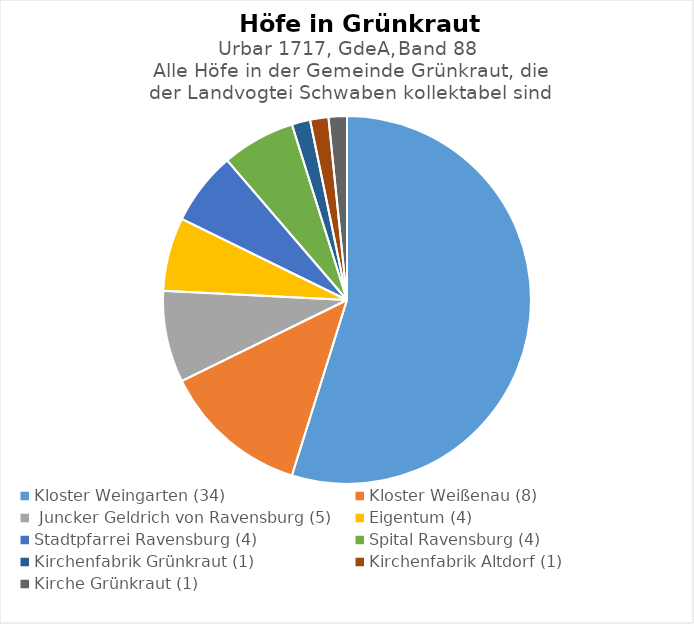
| Category | Series 0 |
|---|---|
| Kloster Weingarten (34) | 34 |
| Kloster Weißenau (8) | 8 |
|  Juncker Geldrich von Ravensburg (5) | 5 |
| Eigentum (4) | 4 |
| Stadtpfarrei Ravensburg (4) | 4 |
| Spital Ravensburg (4) | 4 |
| Kirchenfabrik Grünkraut (1) | 1 |
| Kirchenfabrik Altdorf (1) | 1 |
| Kirche Grünkraut (1) | 1 |